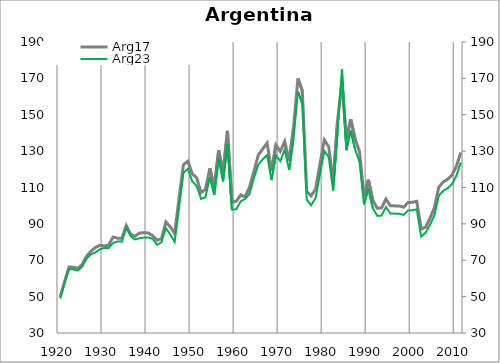
| Category | Arg17 |
|---|---|
| 1920.0 | 49.853 |
| 1921.0 | 58.426 |
| 1922.0 | 66.273 |
| 1923.0 | 66.191 |
| 1924.0 | 65.501 |
| 1925.0 | 67.731 |
| 1926.0 | 72.297 |
| 1927.0 | 74.968 |
| 1928.0 | 77.047 |
| 1929.0 | 78.221 |
| 1930.0 | 77.868 |
| 1931.0 | 78.334 |
| 1932.0 | 82.737 |
| 1933.0 | 82.16 |
| 1934.0 | 82.039 |
| 1935.0 | 89.052 |
| 1936.0 | 84.296 |
| 1937.0 | 83.201 |
| 1938.0 | 84.948 |
| 1939.0 | 85.126 |
| 1940.0 | 85.006 |
| 1941.0 | 83.56 |
| 1942.0 | 81.027 |
| 1943.0 | 81.813 |
| 1944.0 | 91.078 |
| 1945.0 | 88.341 |
| 1946.0 | 84.767 |
| 1947.0 | 104.198 |
| 1948.0 | 122.565 |
| 1949.0 | 124.441 |
| 1950.0 | 117.552 |
| 1951.0 | 115.315 |
| 1952.0 | 107.218 |
| 1953.0 | 108.998 |
| 1954.0 | 120.566 |
| 1955.0 | 110.12 |
| 1956.0 | 130.467 |
| 1957.0 | 118.268 |
| 1958.0 | 141.151 |
| 1959.0 | 101.832 |
| 1960.0 | 102.445 |
| 1961.0 | 105.925 |
| 1962.0 | 104.81 |
| 1963.0 | 110.235 |
| 1964.0 | 118.757 |
| 1965.0 | 127.907 |
| 1966.0 | 131.157 |
| 1967.0 | 134.43 |
| 1968.0 | 119.005 |
| 1969.0 | 133.344 |
| 1970.0 | 129.85 |
| 1971.0 | 135.371 |
| 1972.0 | 124.774 |
| 1973.0 | 142.638 |
| 1974.0 | 169.993 |
| 1975.0 | 163.037 |
| 1976.0 | 107.967 |
| 1977.0 | 105.457 |
| 1978.0 | 109.012 |
| 1979.0 | 122.76 |
| 1980.0 | 136.12 |
| 1981.0 | 132.452 |
| 1982.0 | 113.064 |
| 1983.0 | 146.462 |
| 1984.0 | 168.682 |
| 1985.0 | 136.306 |
| 1986.0 | 147.536 |
| 1987.0 | 136.654 |
| 1988.0 | 129.644 |
| 1989.0 | 105.254 |
| 1990.0 | 114.268 |
| 1991.0 | 103.107 |
| 1992.0 | 98.612 |
| 1993.0 | 98.779 |
| 1994.0 | 103.687 |
| 1995.0 | 99.939 |
| 1996.0 | 99.896 |
| 1997.0 | 99.871 |
| 1998.0 | 99.161 |
| 1999.0 | 101.729 |
| 2000.0 | 101.891 |
| 2001.0 | 102.416 |
| 2002.0 | 87.206 |
| 2003.0 | 88.134 |
| 2004.0 | 93.079 |
| 2005.0 | 98.889 |
| 2006.0 | 110.226 |
| 2007.0 | 112.993 |
| 2008.0 | 114.485 |
| 2009.0 | 116.854 |
| 2010.0 | 121.689 |
| 2011.0 | 129.237 |